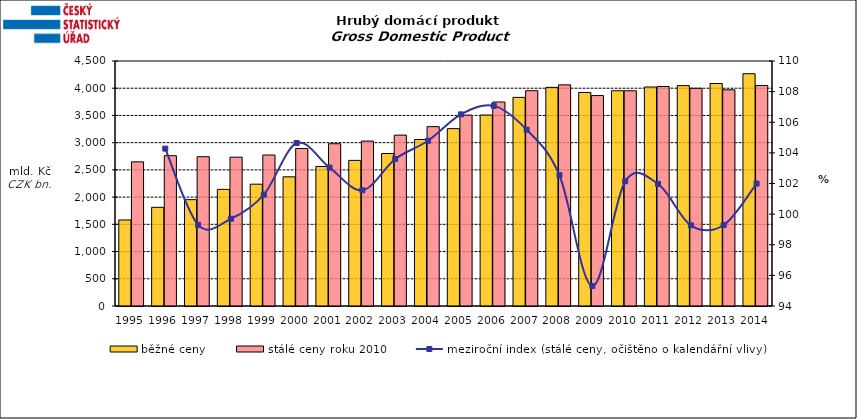
| Category | běžné ceny
 | stálé ceny roku 2010
 |
|---|---|---|
| 1995 | 1580.115 | 2647.661 |
| 1996 | 1812.622 | 2761.055 |
| 1997 | 1953.311 | 2742.438 |
| 1998 | 2142.587 | 2733.771 |
| 1999 | 2237.3 | 2773.084 |
| 2000 | 2372.63 | 2892.164 |
| 2001 | 2562.679 | 2980.419 |
| 2002 | 2674.634 | 3029.505 |
| 2003 | 2801.163 | 3138.623 |
| 2004 | 3057.66 | 3293.905 |
| 2005 | 3257.972 | 3506.107 |
| 2006 | 3507.131 | 3747.206 |
| 2007 | 3831.819 | 3954.399 |
| 2008 | 4015.346 | 4061.601 |
| 2009 | 3921.827 | 3864.947 |
| 2010 | 3953.651 | 3953.651 |
| 2011 | 4022.41 | 4031.292 |
| 2012 | 4047.675 | 3998.703 |
| 2013 | 4086.26 | 3970.646 |
| 2014 | 4266.141 | 4049.726 |